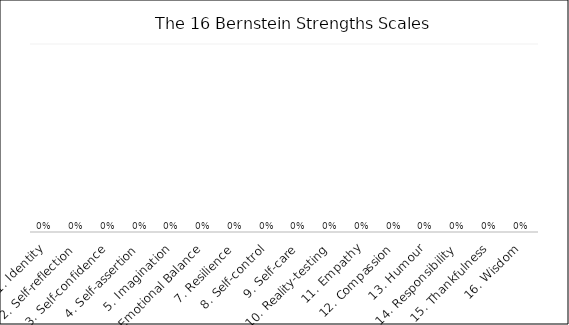
| Category | Series 0 |
|---|---|
| 1. Identity | 0 |
| 2. Self-reflection | 0 |
| 3. Self-confidence | 0 |
| 4. Self-assertion | 0 |
| 5. Imagination | 0 |
| 6. Emotional Balance | 0 |
| 7. Resilience | 0 |
| 8. Self-control | 0 |
| 9. Self-care | 0 |
| 10. Reality-testing | 0 |
| 11. Empathy | 0 |
| 12. Compassion | 0 |
| 13. Humour | 0 |
| 14. Responsibility | 0 |
| 15. Thankfulness | 0 |
| 16. Wisdom | 0 |